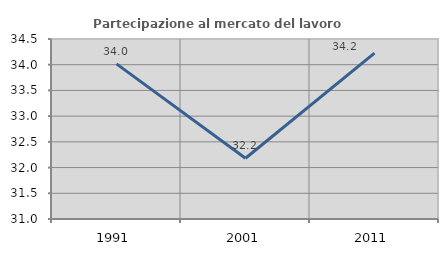
| Category | Partecipazione al mercato del lavoro  femminile |
|---|---|
| 1991.0 | 34.016 |
| 2001.0 | 32.181 |
| 2011.0 | 34.227 |